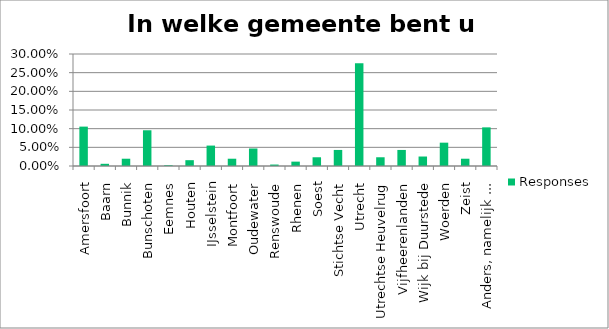
| Category | Responses |
|---|---|
| Amersfoort | 0.106 |
| Baarn | 0.006 |
| Bunnik | 0.02 |
| Bunschoten | 0.096 |
| Eemnes | 0.002 |
| Houten | 0.016 |
| IJsselstein | 0.055 |
| Montfoort | 0.02 |
| Oudewater | 0.047 |
| Renswoude | 0.004 |
| Rhenen | 0.012 |
| Soest | 0.023 |
| Stichtse Vecht | 0.043 |
| Utrecht | 0.275 |
| Utrechtse Heuvelrug | 0.023 |
| Vijfheerenlanden | 0.043 |
| Wijk bij Duurstede | 0.025 |
| Woerden | 0.062 |
| Zeist | 0.02 |
| Anders, namelijk ... | 0.104 |